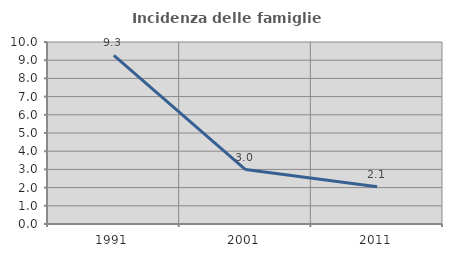
| Category | Incidenza delle famiglie numerose |
|---|---|
| 1991.0 | 9.266 |
| 2001.0 | 2.994 |
| 2011.0 | 2.053 |